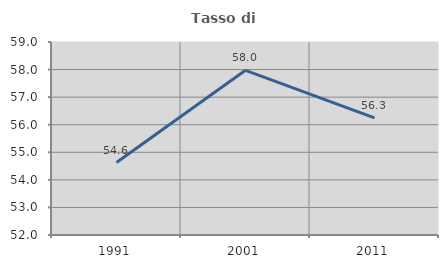
| Category | Tasso di occupazione   |
|---|---|
| 1991.0 | 54.628 |
| 2001.0 | 57.973 |
| 2011.0 | 56.251 |